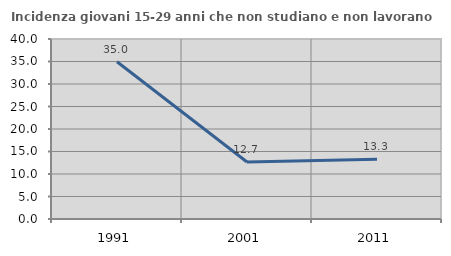
| Category | Incidenza giovani 15-29 anni che non studiano e non lavorano  |
|---|---|
| 1991.0 | 34.951 |
| 2001.0 | 12.667 |
| 2011.0 | 13.258 |